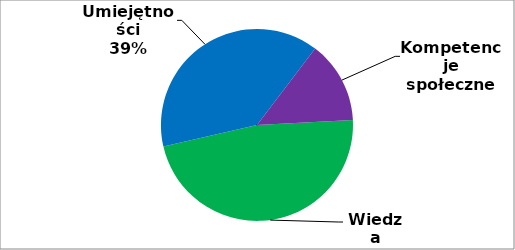
| Category | Series 0 |
|---|---|
| 0 | 284 |
| 1 | 234 |
| 2 | 83 |